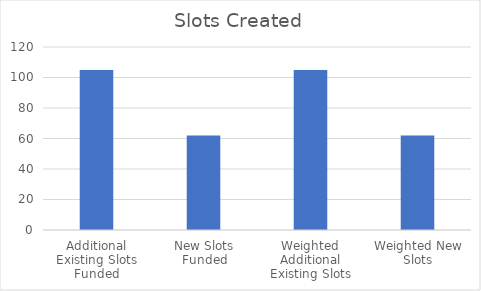
| Category | Total |
|---|---|
| Additional Existing Slots Funded | 105 |
| New Slots Funded | 62 |
| Weighted Additional Existing Slots | 105 |
| Weighted New Slots | 62 |